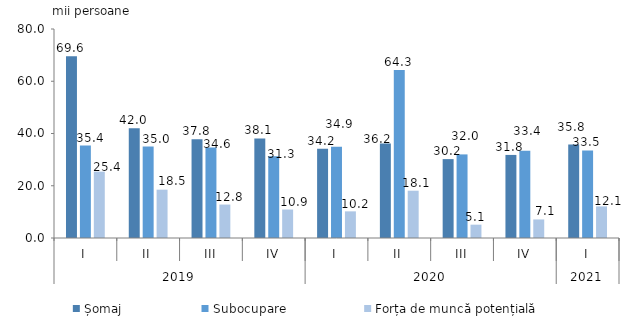
| Category | Șomaj | Subocupare | Forța de muncă potențială |
|---|---|---|---|
| 0 | 69.6 | 35.4 | 25.4 |
| 1 | 42 | 35 | 18.5 |
| 2 | 37.8 | 34.6 | 12.8 |
| 3 | 38.1 | 31.3 | 10.9 |
| 4 | 34.2 | 34.9 | 10.2 |
| 5 | 36.2 | 64.3 | 18.1 |
| 6 | 30.2 | 32 | 5.1 |
| 7 | 31.8 | 33.4 | 7.1 |
| 8 | 35.8 | 33.5 | 12.1 |